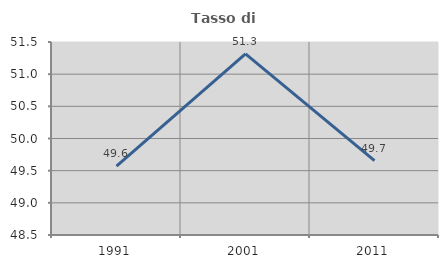
| Category | Tasso di occupazione   |
|---|---|
| 1991.0 | 49.569 |
| 2001.0 | 51.315 |
| 2011.0 | 49.655 |